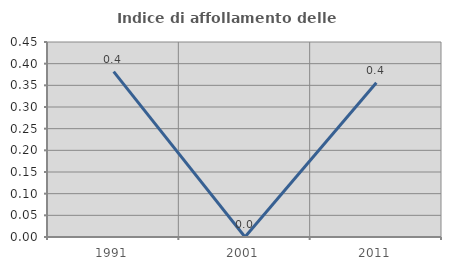
| Category | Indice di affollamento delle abitazioni  |
|---|---|
| 1991.0 | 0.382 |
| 2001.0 | 0 |
| 2011.0 | 0.356 |